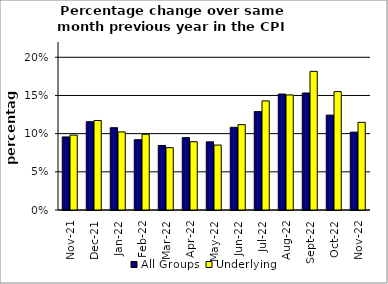
| Category | All Groups | Underlying |
|---|---|---|
| 2021-11-01 | 0.096 | 0.098 |
| 2021-12-01 | 0.116 | 0.117 |
| 2022-01-01 | 0.108 | 0.102 |
| 2022-02-01 | 0.092 | 0.099 |
| 2022-03-01 | 0.085 | 0.082 |
| 2022-04-01 | 0.095 | 0.089 |
| 2022-05-01 | 0.089 | 0.085 |
| 2022-06-01 | 0.108 | 0.112 |
| 2022-07-01 | 0.129 | 0.143 |
| 2022-08-01 | 0.152 | 0.151 |
| 2022-09-01 | 0.153 | 0.182 |
| 2022-10-01 | 0.124 | 0.155 |
| 2022-11-01 | 0.102 | 0.115 |